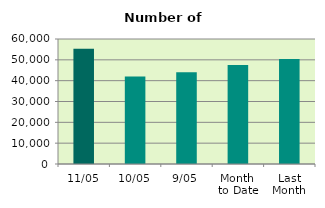
| Category | Series 0 |
|---|---|
| 11/05 | 55358 |
| 10/05 | 41962 |
| 9/05 | 44068 |
| Month 
to Date | 47470.5 |
| Last
Month | 50445.556 |